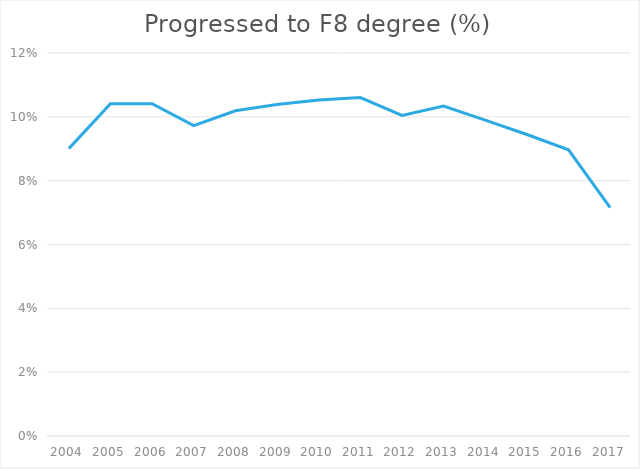
| Category | Percent progressing to geography degree |
|---|---|
| 2004.0 | 0.09 |
| 2005.0 | 0.104 |
| 2006.0 | 0.104 |
| 2007.0 | 0.097 |
| 2008.0 | 0.102 |
| 2009.0 | 0.104 |
| 2010.0 | 0.105 |
| 2011.0 | 0.106 |
| 2012.0 | 0.1 |
| 2013.0 | 0.103 |
| 2014.0 | 0.099 |
| 2015.0 | 0.094 |
| 2016.0 | 0.09 |
| 2017.0 | 0.072 |